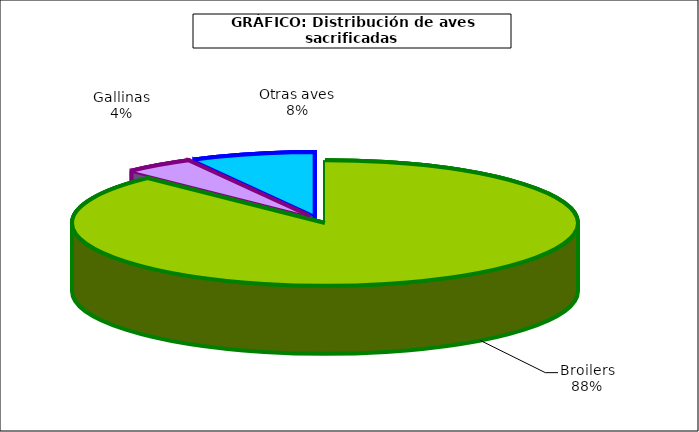
| Category | Series 0 |
|---|---|
| 0 | 716259.103 |
| 1 | 36530.975 |
| 2 | 64530.783 |